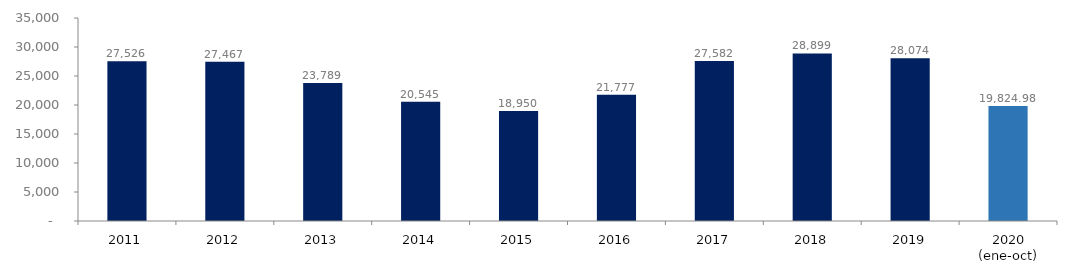
| Category | Series 1 |
|---|---|
| 2011 | 27525.675 |
| 2012 | 27466.673 |
| 2013 | 23789.445 |
| 2014 | 20545.414 |
| 2015 | 18950.14 |
| 2016 | 21776.636 |
| 2017 | 27581.607 |
| 2018 | 28898.658 |
| 2019 | 28073.793 |
| 2020 (ene-oct) | 19824.981 |